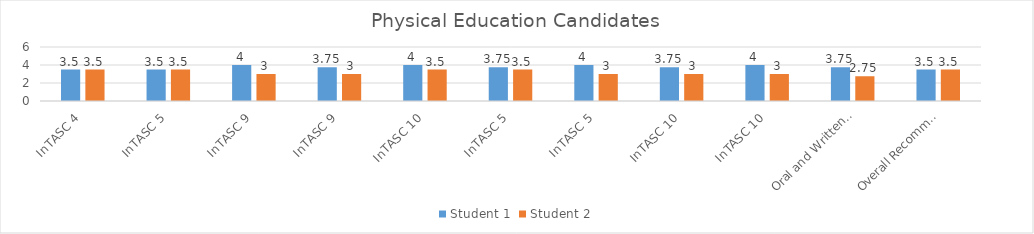
| Category | Student 1 | Student 2 |
|---|---|---|
| InTASC 4 | 3.5 | 3.5 |
| InTASC 5 | 3.5 | 3.5 |
| InTASC 9 | 4 | 3 |
| InTASC 9 | 3.75 | 3 |
| InTASC 10 | 4 | 3.5 |
| InTASC 5 | 3.75 | 3.5 |
| InTASC 5 | 4 | 3 |
| InTASC 10 | 3.75 | 3 |
| InTASC 10 | 4 | 3 |
| Oral and Written Communication | 3.75 | 2.75 |
| Overall Recommendation | 3.5 | 3.5 |